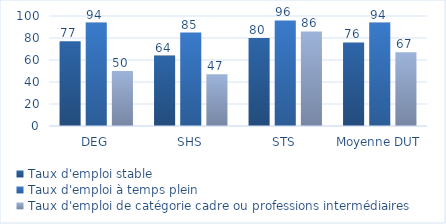
| Category | Taux d'emploi stable | Taux d'emploi à temps plein | Taux d'emploi de catégorie cadre ou professions intermédiaires |
|---|---|---|---|
| DEG | 77 | 94 | 50 |
| SHS | 64 | 85 | 47 |
| STS | 80 | 96 | 86 |
| Moyenne DUT | 76 | 94 | 67 |